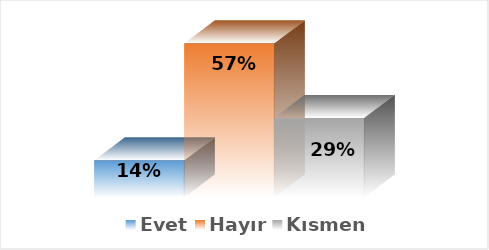
| Category | Evet | Hayır | Kısmen |
|---|---|---|---|
| 0 | 0.137 | 0.569 | 0.294 |